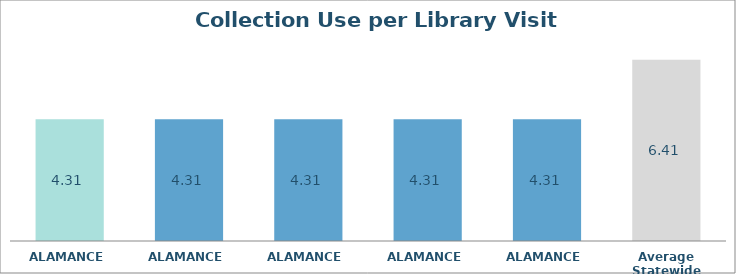
| Category | Series 0 |
|---|---|
| ALAMANCE  | 4.309 |
| ALAMANCE  | 4.309 |
| ALAMANCE  | 4.309 |
| ALAMANCE  | 4.309 |
| ALAMANCE  | 4.309 |
| Average Statewide | 6.409 |